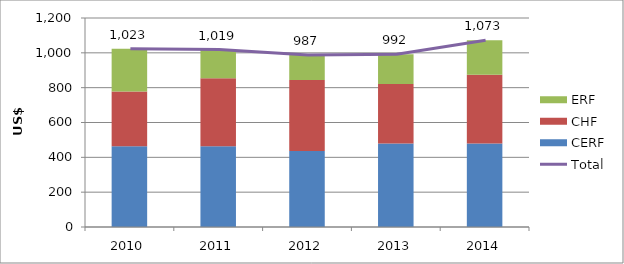
| Category | CERF | CHF | ERF |
|---|---|---|---|
| 2010.0 | 463.115 | 315.353 | 244.918 |
| 2011.0 | 463.709 | 389.645 | 165.176 |
| 2012.0 | 436.465 | 407.666 | 142.997 |
| 2013.0 | 478.75 | 342.068 | 171.589 |
| 2014.0 | 479.524 | 395.171 | 197.993 |